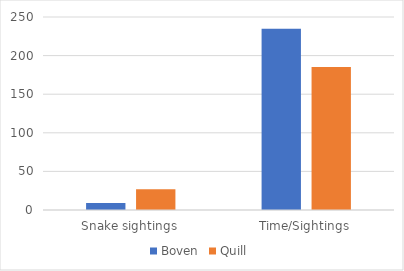
| Category | Boven | Quill |
|---|---|---|
| Snake sightings | 9 | 27 |
| Time/Sightings | 234.889 | 185.259 |